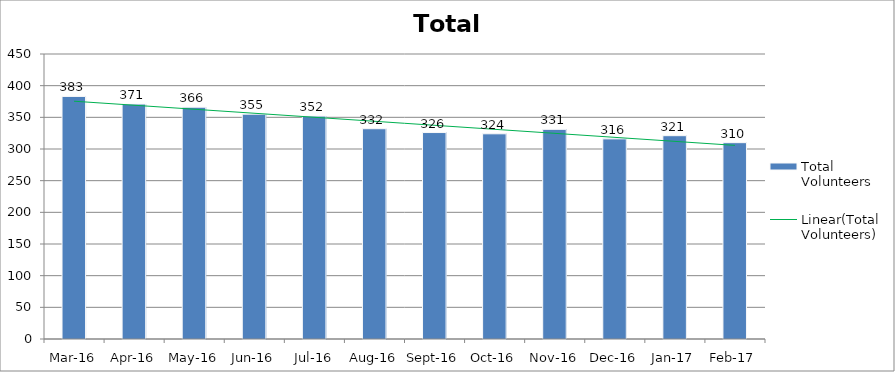
| Category | Total Volunteers |
|---|---|
| Mar-16 | 383 |
| Apr-16 | 371 |
| May-16 | 366 |
| Jun-16 | 355 |
| Jul-16 | 352 |
| Aug-16 | 332 |
| Sep-16 | 326 |
| Oct-16 | 324 |
| Nov-16 | 331 |
| Dec-16 | 316 |
| Jan-17 | 321 |
| Feb-17 | 310 |